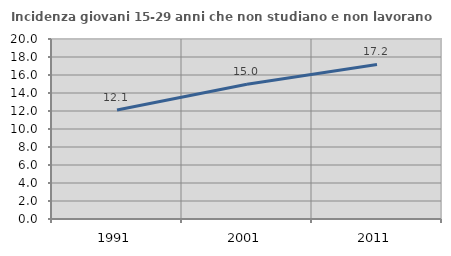
| Category | Incidenza giovani 15-29 anni che non studiano e non lavorano  |
|---|---|
| 1991.0 | 12.107 |
| 2001.0 | 14.982 |
| 2011.0 | 17.172 |